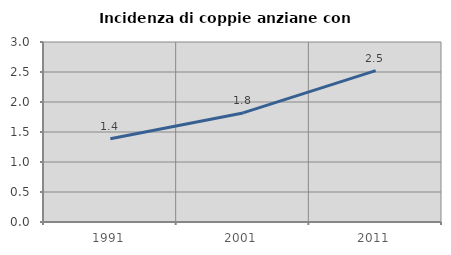
| Category | Incidenza di coppie anziane con figli |
|---|---|
| 1991.0 | 1.389 |
| 2001.0 | 1.818 |
| 2011.0 | 2.523 |